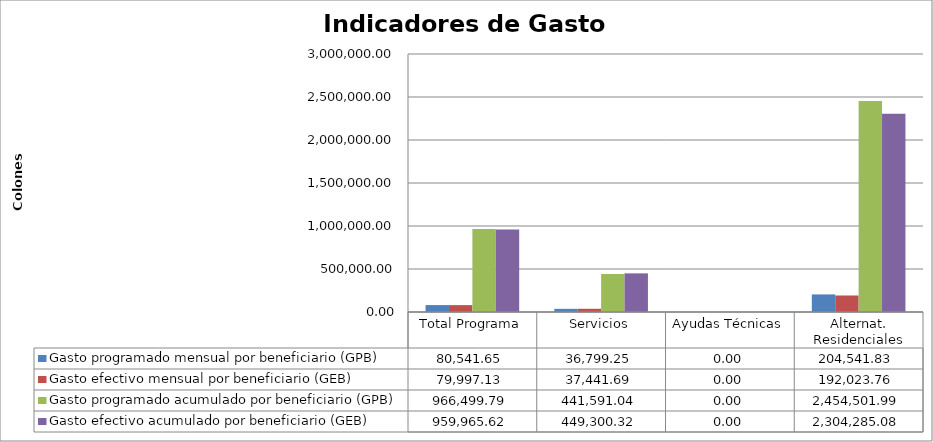
| Category | Gasto programado mensual por beneficiario (GPB)  | Gasto efectivo mensual por beneficiario (GEB)  | Gasto programado acumulado por beneficiario (GPB)  | Gasto efectivo acumulado por beneficiario (GEB)  |
|---|---|---|---|---|
| Total Programa | 80541.65 | 79997.135 | 966499.794 | 959965.619 |
| Servicios | 36799.254 | 37441.693 | 441591.044 | 449300.316 |
| Ayudas Técnicas | 0 | 0 | 0 | 0 |
| Alternat. Residenciales | 204541.833 | 192023.756 | 2454501.99 | 2304285.077 |